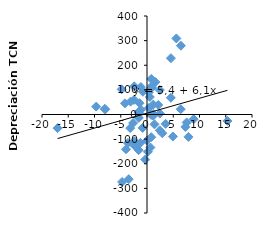
| Category | Chile |
|---|---|
| 0.660000000000005 | -133.978 |
| 15.32 | -26.069 |
| -17.02999999999999 | -55.44 |
| -4.74 | -273.827 |
| 2.9099999999999904 | -76.075 |
| -8.040000000000003 | 22.797 |
| -1.419999999999999 | 46.075 |
| -3.9999999999999925 | -141.268 |
| -9.68 | 32.016 |
| 5.5899999999999945 | 308.931 |
| -2.42 | 114.333 |
| 4.9399999999999995 | -89.513 |
| 0.34000000000000696 | 89.745 |
| -1.6199999999999992 | 9.764 |
| -2.410000000000001 | -108.861 |
| -1.5900000000000025 | -144.795 |
| 8.889999999999997 | -18.975 |
| 0.18000000000000238 | -151.332 |
| -4.830000000000001 | 102.151 |
| 1.419999999999999 | -39.848 |
| -2.4699999999999998 | 59.197 |
| -7.9600000000000035 | 20.93 |
| 3.6500000000000004 | 617.456 |
| 0.20000000000000018 | 94.864 |
| 1.5899999999999999 | 131.677 |
| -2.37 | -124.568 |
| 6.429999999999997 | 21.606 |
| -0.8400000000000019 | -54.479 |
| 0.8199999999999985 | 144.392 |
| 1.200000000000001 | 40.341 |
| 0.8000000000000007 | -92.03 |
| 2.430000000000004 | -64.416 |
| 1.200000000000001 | -4.84 |
| -1.5600000000000003 | -13.784 |
| 0.8099999999999996 | -1.692 |
| -1.16 | 19.3 |
| 6.459999999999999 | 279.508 |
| 1.200000000000001 | 1.94 |
| -3.63 | -115.821 |
| -0.7699999999999985 | 92.529 |
| 4.539999999999999 | 67.837 |
| 0.37000000000000366 | 26.526 |
| 7.31 | -50.39 |
| -3.1300000000000052 | 52.211 |
| -3.200000000000003 | -55.149 |
| -1.1700000000000044 | 111.436 |
| 2.4399999999999977 | 99.624 |
| 7.5600000000000005 | -32.353 |
| 7.899999999999996 | -90.853 |
| 0.5300000000000082 | 71.158 |
| -2.650000000000008 | -34.467 |
| 0.9250000000000091 | 108.612 |
| -2.3249999999999993 | -127.013 |
| 0.9399999999999964 | 116.26 |
| -4.200000000000004 | 45.38 |
| 2.4499999999999966 | 3.775 |
| 3.5500000000000087 | -38.047 |
| -0.01500000000000945 | -105.757 |
| -3.4800000000000164 | -262.745 |
| -1.2599999999999945 | -115.138 |
| -1.475000000000004 | 3.338 |
| 2.1399999999999864 | 38.642 |
| -0.33400000000001207 | -182.774 |
| -1.556000000000024 | 9.671 |
| 4.5560000000000045 | 228.729 |